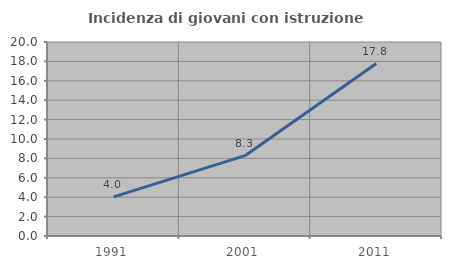
| Category | Incidenza di giovani con istruzione universitaria |
|---|---|
| 1991.0 | 4.027 |
| 2001.0 | 8.28 |
| 2011.0 | 17.778 |